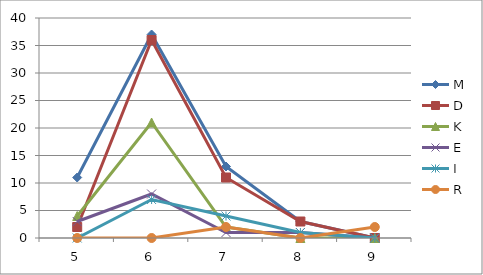
| Category | M | D | K | E | I | R |
|---|---|---|---|---|---|---|
| 5.0 | 11 | 2 | 4 | 3 | 0 | 0 |
| 6.0 | 37 | 36 | 21 | 8 | 7 | 0 |
| 7.0 | 13 | 11 | 2 | 1 | 4 | 2 |
| 8.0 | 3 | 3 | 0 | 1 | 1 | 0 |
| 9.0 | 0 | 0 | 0 | 0 | 0 | 2 |